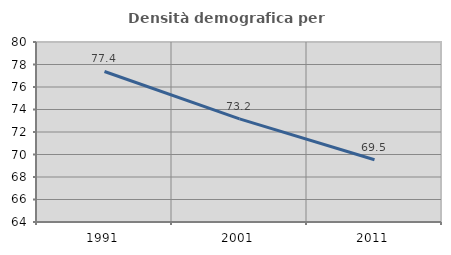
| Category | Densità demografica |
|---|---|
| 1991.0 | 77.38 |
| 2001.0 | 73.166 |
| 2011.0 | 69.531 |